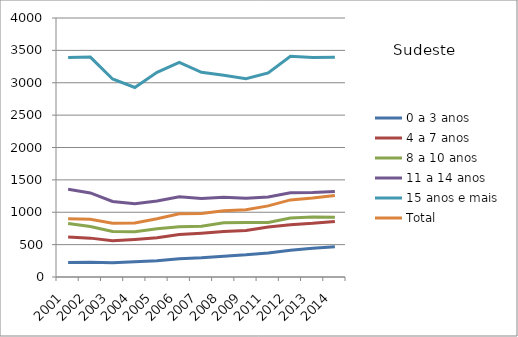
| Category | 0 a 3 anos | 4 a 7 anos | 8 a 10 anos | 11 a 14 anos | 15 anos e mais | Total |
|---|---|---|---|---|---|---|
| 2001.0 | 223.2 | 618.7 | 825 | 1354.7 | 3388.6 | 897.9 |
| 2002.0 | 227.8 | 600.3 | 779 | 1298.8 | 3396.5 | 890.4 |
| 2003.0 | 220 | 560.8 | 702.2 | 1166.6 | 3057.8 | 831.5 |
| 2004.0 | 235 | 580.8 | 700 | 1131.2 | 2927.4 | 835.5 |
| 2005.0 | 251.9 | 606.5 | 743.9 | 1174.4 | 3160.5 | 899.3 |
| 2006.0 | 283.5 | 655.6 | 777.2 | 1238.7 | 3314.8 | 978 |
| 2007.0 | 298.7 | 676.6 | 785.1 | 1213.4 | 3161.9 | 981.8 |
| 2008.0 | 321.8 | 703.7 | 836.1 | 1232.9 | 3115.8 | 1022.1 |
| 2009.0 | 342.4 | 716.6 | 842.7 | 1215.3 | 3062.3 | 1038.8 |
| 2011.0 | 372 | 773 | 842.9 | 1235.7 | 3152.4 | 1098.1 |
| 2012.0 | 414.7 | 806.8 | 910.6 | 1299.4 | 3410.2 | 1190.5 |
| 2013.0 | 445.2 | 828.4 | 927.9 | 1303.2 | 3389.2 | 1220 |
| 2014.0 | 467.5 | 858.8 | 924.3 | 1322.3 | 3393.7 | 1260.4 |